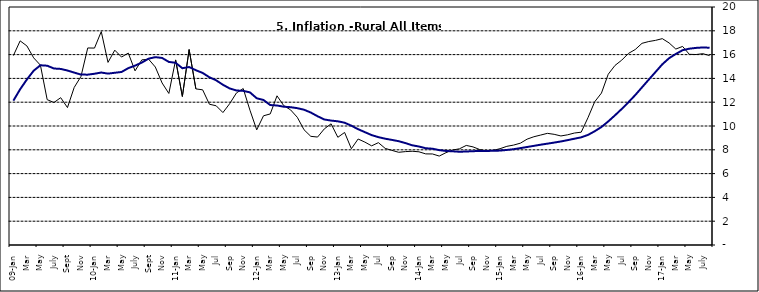
| Category | Year-on Rate | 12-Month Average |
|---|---|---|
| 09-Jan | 15.918 | 12.128 |
| Feb | 17.154 | 13.086 |
| Mar | 16.729 | 13.912 |
| Apr | 15.727 | 14.644 |
| May | 15.113 | 15.104 |
| June | 12.213 | 15.067 |
| July | 11.974 | 14.832 |
| Aug | 12.38 | 14.796 |
| Sept | 11.548 | 14.661 |
| Oct | 13.242 | 14.488 |
| Nov | 14.164 | 14.321 |
|  | 16.557 | 14.316 |
| 10-Jan | 16.548 | 14.39 |
| Feb | 17.934 | 14.494 |
| Mar | 15.346 | 14.401 |
| Apr | 16.373 | 14.473 |
| May | 15.794 | 14.54 |
| June | 16.126 | 14.862 |
| July | 14.634 | 15.072 |
| Aug | 15.556 | 15.33 |
| Sept | 15.616 | 15.658 |
| Oct | 14.955 | 15.786 |
| Nov | 13.616 | 15.719 |
| Dec | 12.735 | 15.385 |
| 11-Jan | 15.553 | 15.311 |
| Feb | 12.482 | 14.856 |
| Mar | 16.422 | 14.956 |
| Apr | 13.117 | 14.687 |
| May | 13.041 | 14.457 |
| Jun | 11.83 | 14.095 |
| Jul | 11.699 | 13.84 |
| Aug | 11.13 | 13.464 |
| Sep | 11.878 | 13.156 |
| Oct | 12.778 | 12.985 |
| Nov | 13.147 | 12.95 |
| Dec | 11.326 | 12.824 |
| 12-Jan | 9.678 | 12.33 |
| Feb | 10.856 | 12.188 |
| Mar | 11.014 | 11.76 |
| Apr | 12.536 | 11.724 |
| May | 11.712 | 11.621 |
| Jun | 11.36 | 11.582 |
| Jul | 10.733 | 11.499 |
| Aug | 9.683 | 11.368 |
| Sep | 9.132 | 11.131 |
| Oct | 9.071 | 10.82 |
| Nov | 9.758 | 10.548 |
| Dec | 10.183 | 10.455 |
| 13-Jan | 9.052 | 10.394 |
| Feb | 9.457 | 10.276 |
| Mar | 8.091 | 10.025 |
| Apr | 8.907 | 9.732 |
| May | 8.647 | 9.483 |
| Jun | 8.333 | 9.236 |
| Jul | 8.6 | 9.063 |
| Aug | 8.12 | 8.933 |
| Sep | 7.95 | 8.832 |
| Oct | 7.791 | 8.722 |
| Nov | 7.849 | 8.565 |
| Dec | 7.879 | 8.378 |
| 14-Jan | 7.832 | 8.277 |
| Feb | 7.657 | 8.13 |
| Mar | 7.65 | 8.092 |
| Apr | 7.473 | 7.973 |
| May | 7.761 | 7.901 |
| Jun | 7.98 | 7.874 |
| Jul | 8.086 | 7.834 |
| Aug | 8.368 | 7.858 |
| Sep | 8.244 | 7.883 |
| Oct | 8.019 | 7.903 |
| Nov | 7.898 | 7.906 |
| Dec | 7.955 | 7.913 |
| 15-Jan | 8.094 | 7.935 |
| Feb | 8.291 | 7.988 |
| Mar | 8.396 | 8.05 |
| Apr | 8.556 | 8.14 |
| May | 8.896 | 8.236 |
| Jun | 9.098 | 8.331 |
| Jul | 9.238 | 8.429 |
| Aug | 9.382 | 8.516 |
| Sep | 9.3 | 8.606 |
| Oct | 9.162 | 8.7 |
| Nov | 9.261 | 8.813 |
| Dec | 9.41 | 8.933 |
| 16-Jan | 9.48 | 9.047 |
| Feb | 10.692 | 9.249 |
| Mar | 12.038 | 9.559 |
| Apr | 12.767 | 9.917 |
| May | 14.349 | 10.384 |
| Jun | 15.088 | 10.897 |
| Jul | 15.533 | 11.433 |
| Aug | 16.103 | 12.002 |
| Sep | 16.428 | 12.601 |
| Oct | 16.947 | 13.25 |
| Nov | 17.099 | 13.898 |
| Dec | 17.195 | 14.54 |
| 17-Jan | 17.341 | 15.183 |
| Feb | 16.982 | 15.696 |
| Mar | 16.466 | 16.054 |
| Apr | 16.687 | 16.369 |
| May | 16.023 | 16.497 |
| June | 16.007 | 16.563 |
| July | 16.078 | 16.6 |
| August | 15.914 | 16.577 |